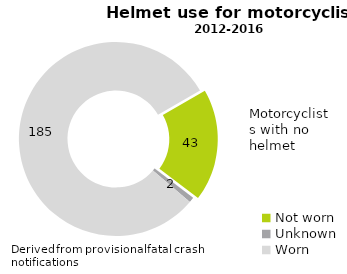
| Category | Series 0 |
|---|---|
| Not worn | 43 |
| Unknown | 2 |
| Worn | 185 |